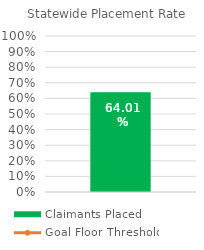
| Category | Claimants Placed |
|---|---|
| 0 | 0.64 |